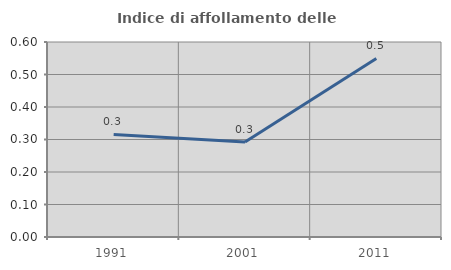
| Category | Indice di affollamento delle abitazioni  |
|---|---|
| 1991.0 | 0.315 |
| 2001.0 | 0.292 |
| 2011.0 | 0.549 |